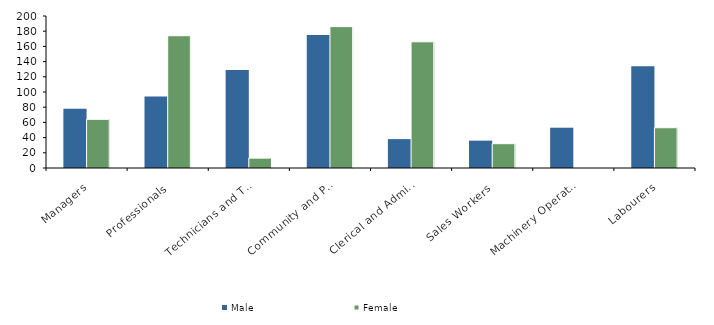
| Category | Male | Female |
|---|---|---|
| Managers | 78 | 64 |
| Professionals | 94 | 174 |
| Technicians and Trades Workers | 129 | 13 |
| Community and Personal Service Workers | 175 | 186 |
| Clerical and Administrative Workers | 38 | 166 |
| Sales Workers | 36 | 32 |
| Machinery Operators and Drivers | 53 | 0 |
| Labourers | 134 | 53 |